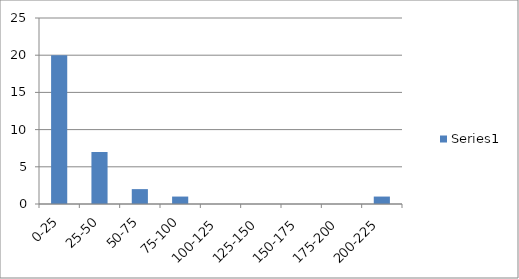
| Category | Series 0 |
|---|---|
| 0-25 | 20 |
| 25-50 | 7 |
| 50-75 | 2 |
| 75-100 | 1 |
| 100-125 | 0 |
| 125-150 | 0 |
| 150-175 | 0 |
| 175-200 | 0 |
| 200-225 | 1 |